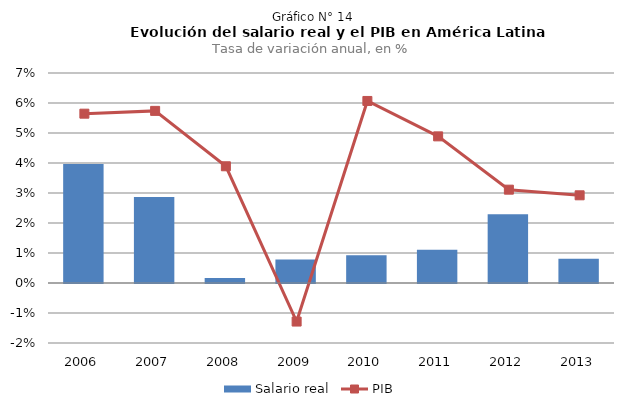
| Category | Salario real |
|---|---|
| 2006.0 | 0.04 |
| 2007.0 | 0.029 |
| 2008.0 | 0.002 |
| 2009.0 | 0.008 |
| 2010.0 | 0.009 |
| 2011.0 | 0.011 |
| 2012.0 | 0.023 |
| 2013.0 | 0.008 |